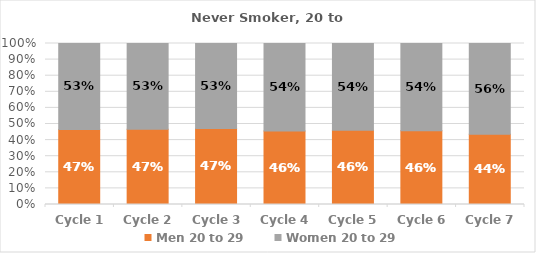
| Category | Men | Women |
|---|---|---|
| Cycle 1 | 0.466 | 0.534 |
| Cycle 2 | 0.467 | 0.533 |
| Cycle 3 | 0.473 | 0.527 |
| Cycle 4 | 0.456 | 0.544 |
| Cycle 5 | 0.461 | 0.539 |
| Cycle 6 | 0.458 | 0.542 |
| Cycle 7 | 0.436 | 0.564 |